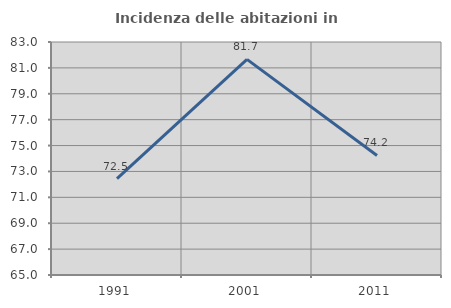
| Category | Incidenza delle abitazioni in proprietà  |
|---|---|
| 1991.0 | 72.453 |
| 2001.0 | 81.661 |
| 2011.0 | 74.237 |